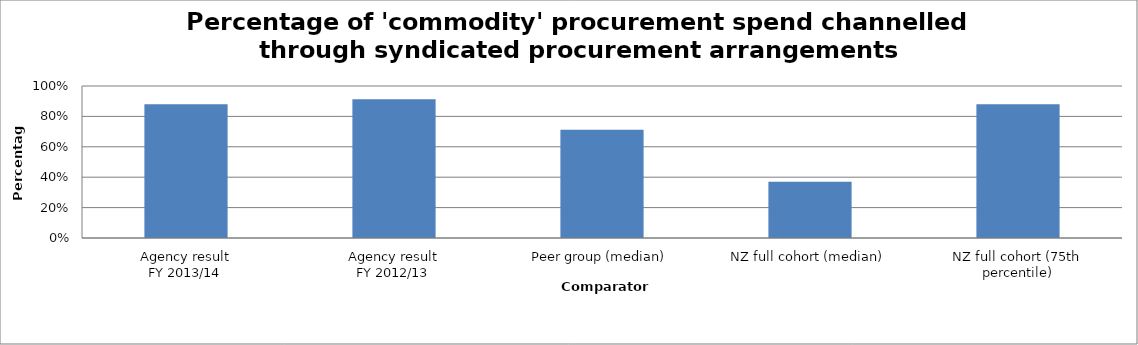
| Category | Result |
|---|---|
| Agency result
FY 2013/14 | 0.881 |
| Agency result
FY 2012/13 | 0.913 |
| Peer group (median) | 0.713 |
| NZ full cohort (median) | 0.37 |
| NZ full cohort (75th percentile) | 0.88 |